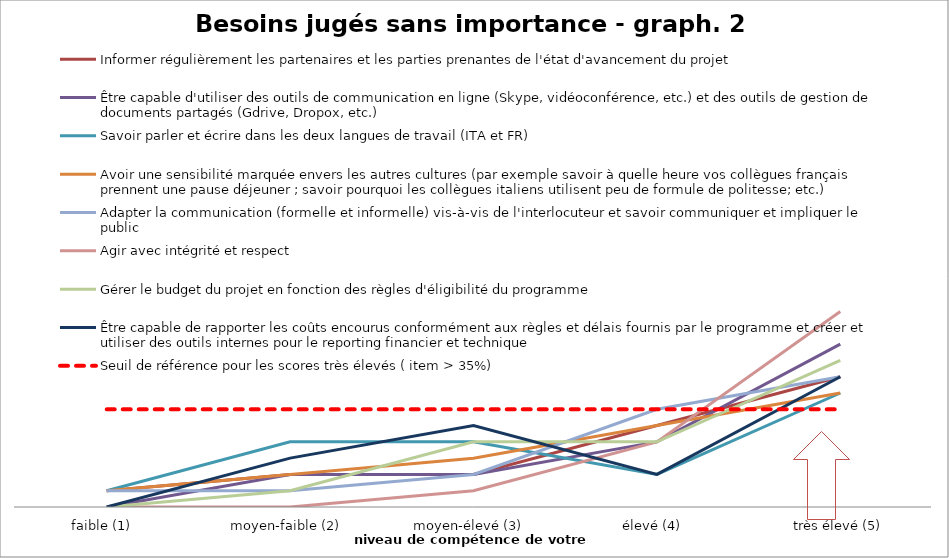
| Category | Informer régulièrement les partenaires et les parties prenantes de l'état d'avancement du projet  | Être capable d'utiliser des outils de communication en ligne (Skype, vidéoconférence, etc.) et des outils de gestion de documents partagés (Gdrive, Dropox, etc.)  | Savoir parler et écrire dans les deux langues de travail (ITA et FR)  | Avoir une sensibilité marquée envers les autres cultures (par exemple savoir à quelle heure vos collègues français prennent une pause déjeuner ; savoir pourquoi les collègues italiens utilisent peu de formule de politesse; etc.)  | Adapter la communication (formelle et informelle) vis-à-vis de l'interlocuteur et savoir communiquer et impliquer le public  | Agir avec intégrité et respect  | Gérer le budget du projet en fonction des règles d'éligibilité du programme  | Être capable de rapporter les coûts encourus conformément aux règles et délais fournis par le programme et créer et utiliser des outils internes pour le reporting financier et technique  | Seuil de référence pour les scores très élevés ( item > 35%) |
|---|---|---|---|---|---|---|---|---|---|
| faible (1)  | 1 | 0 | 1 | 1 | 1 | 0 | 0 | 0 | 6 |
| moyen-faible (2)  | 2 | 2 | 4 | 2 | 1 | 0 | 1 | 3 | 6 |
| moyen-élevé (3)  | 2 | 2 | 4 | 3 | 2 | 1 | 4 | 5 | 6 |
| élevé (4)  | 5 | 4 | 2 | 5 | 6 | 4 | 4 | 2 | 6 |
| très élevé (5) | 8 | 10 | 7 | 7 | 8 | 12 | 9 | 8 | 6 |